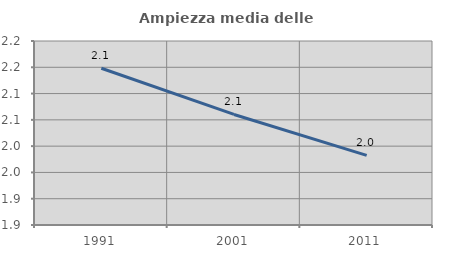
| Category | Ampiezza media delle famiglie |
|---|---|
| 1991.0 | 2.148 |
| 2001.0 | 2.06 |
| 2011.0 | 1.982 |